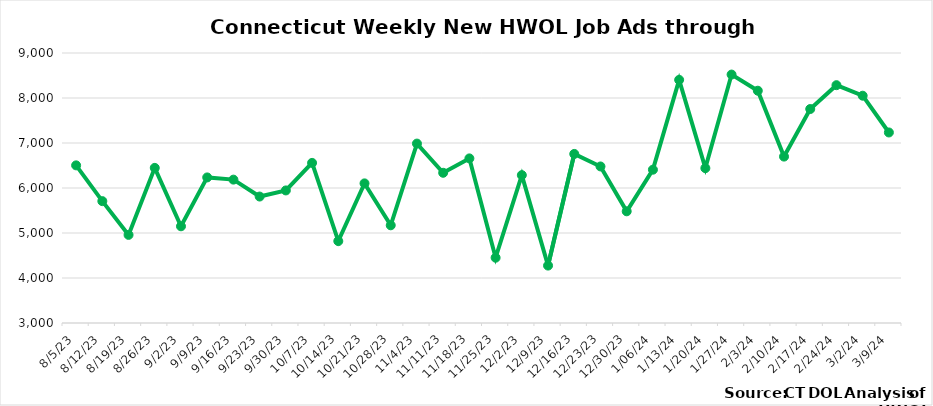
| Category | Connecticut |
|---|---|
| 8/5/23 | 6503 |
| 8/12/23 | 5708 |
| 8/19/23 | 4958 |
| 8/26/23 | 6447 |
| 9/2/23 | 5149 |
| 9/9/23 | 6235 |
| 9/16/23 | 6186 |
| 9/23/23 | 5810 |
| 9/30/23 | 5946 |
| 10/7/23 | 6558 |
| 10/14/23 | 4820 |
| 10/21/23 | 6103 |
| 10/28/23 | 5171 |
| 11/4/23 | 6987 |
| 11/11/23 | 6338 |
| 11/18/23 | 6658 |
| 11/25/23 | 4451 |
| 12/2/23 | 6286 |
| 12/9/23 | 4276 |
| 12/16/23 | 6757 |
|  12/23/23 | 6479 |
|  12/30/23 | 5482 |
|  1/06/24 | 6407 |
|  1/13/24 | 8403 |
|  1/20/24 | 6441 |
|  1/27/24 | 8521 |
|  2/3/24 | 8162 |
|  2/10/24 | 6698 |
|  2/17/24 | 7755 |
|  2/24/24 | 8285 |
|  3/2/24 | 8051 |
|  3/9/24 | 7234 |